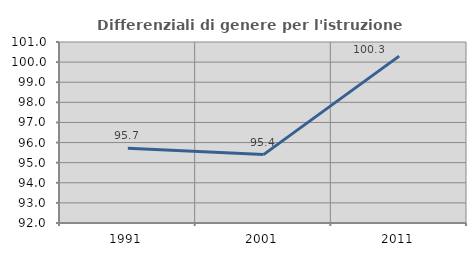
| Category | Differenziali di genere per l'istruzione superiore |
|---|---|
| 1991.0 | 95.719 |
| 2001.0 | 95.401 |
| 2011.0 | 100.297 |